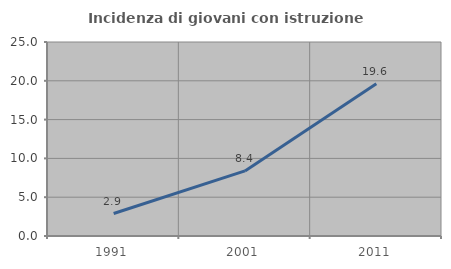
| Category | Incidenza di giovani con istruzione universitaria |
|---|---|
| 1991.0 | 2.899 |
| 2001.0 | 8.383 |
| 2011.0 | 19.608 |